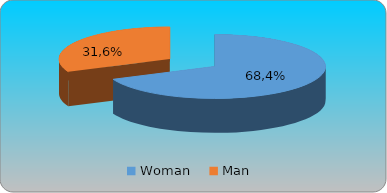
| Category | Series 0 | Series 1 | Series 2 | Series 3 |
|---|---|---|---|---|
| Woman     | 0.684 |  |  |  |
| Man  | 0.316 |  |  |  |